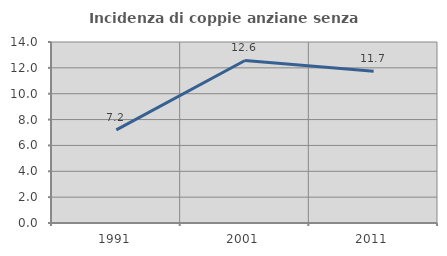
| Category | Incidenza di coppie anziane senza figli  |
|---|---|
| 1991.0 | 7.202 |
| 2001.0 | 12.573 |
| 2011.0 | 11.732 |